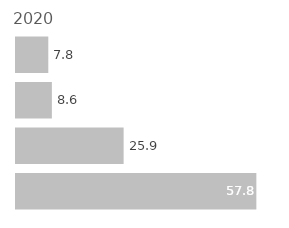
| Category | Series 0 |
|---|---|
| 0 | 57.759 |
| 1 | 25.862 |
| 2 | 8.621 |
| 3 | 7.759 |